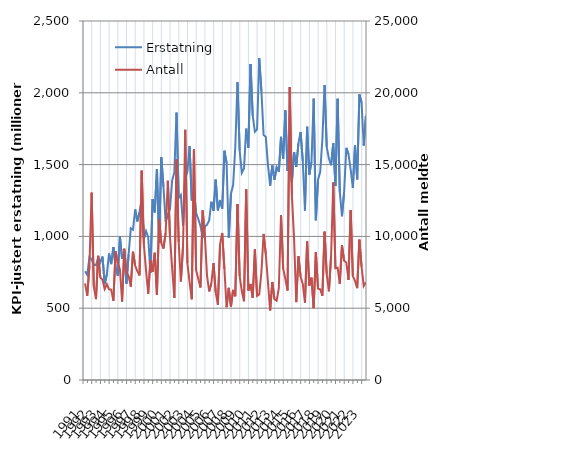
| Category | Erstatning |
|---|---|
| 1991.0 | 756.992 |
| nan | 732.306 |
| nan | 854.457 |
| nan | 839.934 |
| 1992.0 | 803.669 |
| nan | 798.537 |
| nan | 852.619 |
| nan | 818.43 |
| 1993.0 | 859.386 |
| nan | 667.417 |
| nan | 736.367 |
| nan | 881.266 |
| 1994.0 | 806.915 |
| nan | 925.663 |
| nan | 793.362 |
| nan | 724.357 |
| 1995.0 | 998.354 |
| nan | 843.839 |
| nan | 890.374 |
| nan | 671.467 |
| 1996.0 | 874.845 |
| nan | 1056.889 |
| nan | 1046.349 |
| nan | 1187.268 |
| 1997.0 | 1104.294 |
| nan | 1167.795 |
| nan | 1266.048 |
| nan | 984.273 |
| 1998.0 | 1036.917 |
| nan | 993.658 |
| nan | 744.712 |
| nan | 1259.538 |
| 1999.0 | 1167.013 |
| nan | 1469.569 |
| nan | 957.4 |
| nan | 1552.154 |
| 2000.0 | 1346.048 |
| nan | 1101.584 |
| nan | 1151.677 |
| nan | 1188.563 |
| 2001.0 | 1389.318 |
| nan | 1446.181 |
| nan | 1862.119 |
| nan | 1269.053 |
| 2002.0 | 1288.952 |
| nan | 1075.774 |
| nan | 1403.72 |
| nan | 1451.92 |
| 2003.0 | 1629.132 |
| nan | 1250.543 |
| nan | 1320.082 |
| nan | 1162.57 |
| 2004.0 | 1121.24 |
| nan | 1072.595 |
| nan | 991.897 |
| nan | 1068.606 |
| 2005.0 | 1080.186 |
| nan | 1111.288 |
| nan | 1241.457 |
| nan | 1178.087 |
| 2006.0 | 1395.001 |
| nan | 1181.532 |
| nan | 1253.015 |
| nan | 1191.968 |
| 2007.0 | 1596.231 |
| nan | 1512.131 |
| nan | 990.694 |
| nan | 1296.034 |
| 2008.0 | 1357.452 |
| nan | 1624.06 |
| nan | 2073.663 |
| nan | 1597.434 |
| 2009.0 | 1442.346 |
| nan | 1472.565 |
| nan | 1750.244 |
| nan | 1617.137 |
| 2010.0 | 2199.59 |
| nan | 1840.739 |
| nan | 1728.26 |
| nan | 1744.931 |
| 2011.0 | 2240.46 |
| nan | 2010.09 |
| nan | 1705.829 |
| nan | 1693.375 |
| 2012.0 | 1499.899 |
| nan | 1353.188 |
| nan | 1495.402 |
| nan | 1393.323 |
| 2013.0 | 1482.488 |
| nan | 1449.626 |
| nan | 1693.427 |
| nan | 1539.125 |
| 2014.0 | 1877.73 |
| nan | 1455.658 |
| nan | 1579.203 |
| nan | 1378.34 |
| 2015.0 | 1587.997 |
| nan | 1484.431 |
| nan | 1648.534 |
| nan | 1727.346 |
| 2016.0 | 1524.912 |
| nan | 1179.956 |
| nan | 1763.87 |
| nan | 1430.584 |
| 2017.0 | 1520.705 |
| nan | 1959.355 |
| nan | 1112.185 |
| nan | 1394.391 |
| 2018.0 | 1447.668 |
| nan | 1676.208 |
| nan | 2054.885 |
| nan | 1623.42 |
| 2019.0 | 1542.846 |
| nan | 1495.913 |
| nan | 1648.395 |
| nan | 1350.624 |
| 2020.0 | 1958.172 |
| nan | 1311.62 |
| nan | 1140.353 |
| nan | 1311.536 |
| 2021.0 | 1616.757 |
| nan | 1573.102 |
| nan | 1465.287 |
| nan | 1338.133 |
| 2022.0 | 1632.579 |
| nan | 1397.111 |
| nan | 1987.932 |
| nan | 1932.525 |
| 2023.0 | 1632.912 |
| nan | 1839.803 |